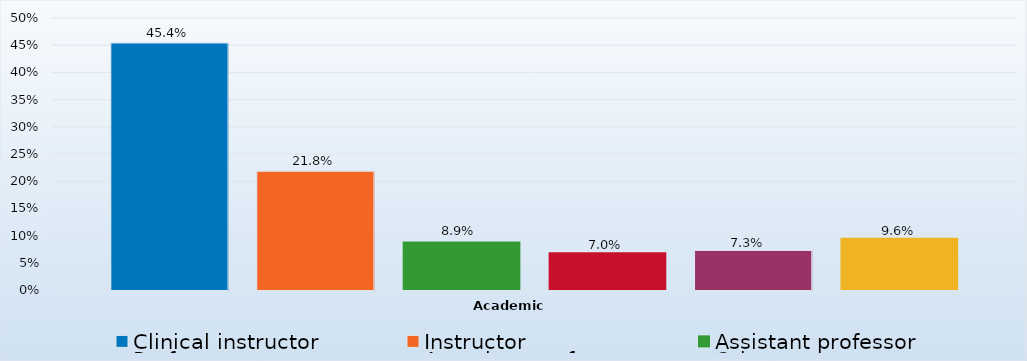
| Category | Clinical instructor | Instructor | Assistant professor | Professor | Associate professor | Other |
|---|---|---|---|---|---|---|
| 0 | 0.454 | 0.218 | 0.089 | 0.07 | 0.073 | 0.096 |